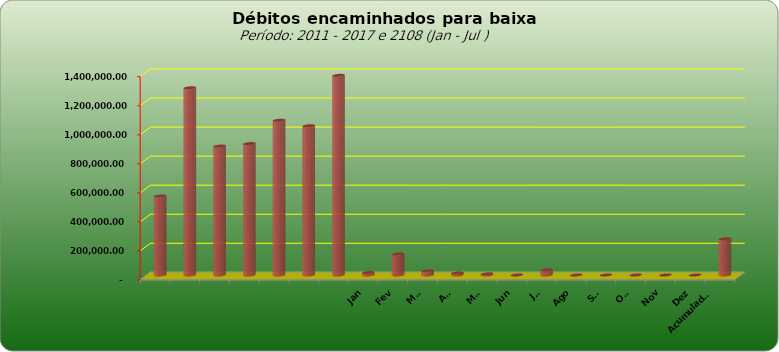
| Category |  543.796,20  |
|---|---|
|  | 543796.2 |
|  | 1289053.69 |
|  | 887573.08 |
|  | 905052.31 |
|  | 1065434.28 |
|  | 1027209.41 |
|  | 1374800.36 |
| Jan | 17005.62 |
| Fev | 145413 |
| Mar | 28943.58 |
| Abr | 13957.8 |
| Mai | 8316.5 |
| Jun | 0 |
| Jul | 35839.29 |
| Ago | 0 |
| Set | 0 |
| Out | 0 |
| Nov | 0 |
| Dez | 0 |
| Acumulado
2016 | 249475.79 |